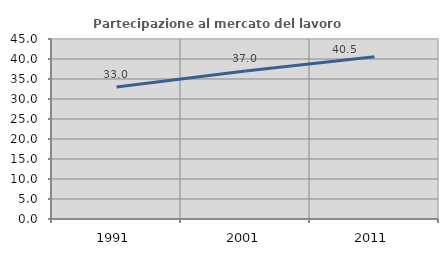
| Category | Partecipazione al mercato del lavoro  femminile |
|---|---|
| 1991.0 | 32.978 |
| 2001.0 | 37.02 |
| 2011.0 | 40.546 |